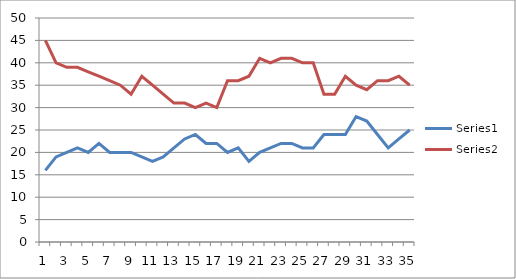
| Category | Series 0 | Series 1 |
|---|---|---|
| 0 | 16 | 45 |
| 1 | 19 | 40 |
| 2 | 20 | 39 |
| 3 | 21 | 39 |
| 4 | 20 | 38 |
| 5 | 22 | 37 |
| 6 | 20 | 36 |
| 7 | 20 | 35 |
| 8 | 20 | 33 |
| 9 | 19 | 37 |
| 10 | 18 | 35 |
| 11 | 19 | 33 |
| 12 | 21 | 31 |
| 13 | 23 | 31 |
| 14 | 24 | 30 |
| 15 | 22 | 31 |
| 16 | 22 | 30 |
| 17 | 20 | 36 |
| 18 | 21 | 36 |
| 19 | 18 | 37 |
| 20 | 20 | 41 |
| 21 | 21 | 40 |
| 22 | 22 | 41 |
| 23 | 22 | 41 |
| 24 | 21 | 40 |
| 25 | 21 | 40 |
| 26 | 24 | 33 |
| 27 | 24 | 33 |
| 28 | 24 | 37 |
| 29 | 28 | 35 |
| 30 | 27 | 34 |
| 31 | 24 | 36 |
| 32 | 21 | 36 |
| 33 | 23 | 37 |
| 34 | 25 | 35 |